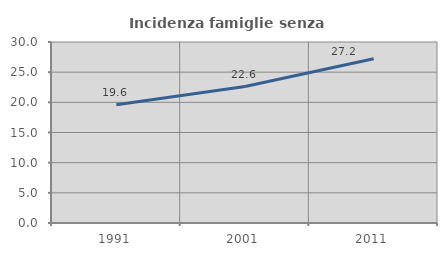
| Category | Incidenza famiglie senza nuclei |
|---|---|
| 1991.0 | 19.597 |
| 2001.0 | 22.62 |
| 2011.0 | 27.21 |